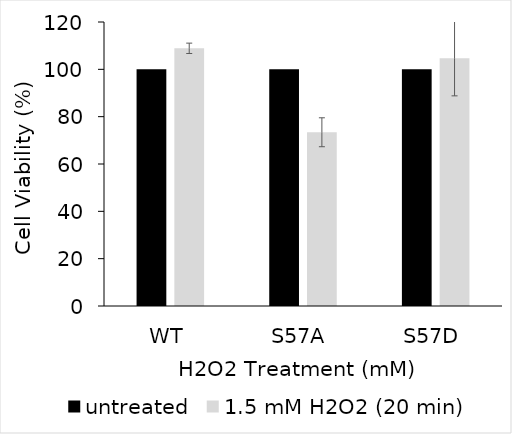
| Category | untreated | 1.5 mM H2O2 (20 min) |
|---|---|---|
| WT | 100 | 108.884 |
| S57A | 100 | 73.413 |
| S57D | 100 | 104.697 |